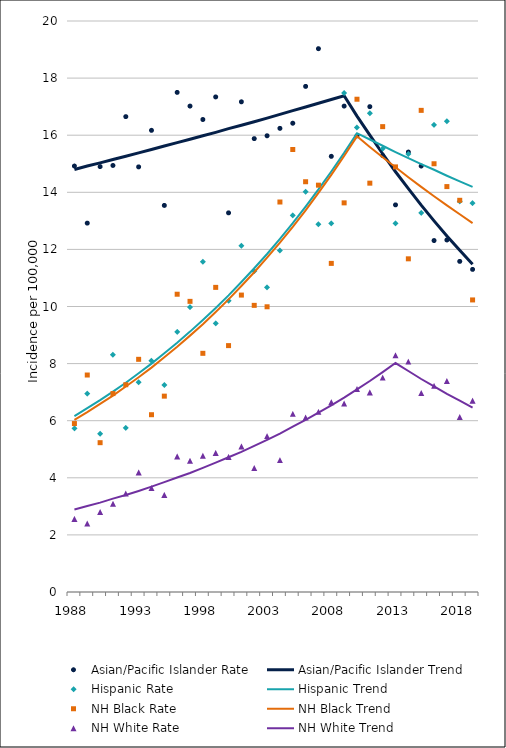
| Category | Asian/Pacific Islander Rate | Asian/Pacific Islander Trend | Hispanic Rate | Hispanic Trend | NH Black Rate | NH Black Trend | NH White Rate | NH White Trend |
|---|---|---|---|---|---|---|---|---|
| 1988.0 | 14.92 | 14.8 | 5.73 | 6.16 | 5.9 | 6.03 | 2.56 | 2.89 |
| 1989.0 | 12.92 | 14.92 | 6.95 | 6.44 | 7.6 | 6.3 | 2.4 | 3.01 |
| 1990.0 | 14.9 | 15.03 | 5.54 | 6.72 | 5.23 | 6.59 | 2.8 | 3.13 |
| 1991.0 | 14.94 | 15.15 | 8.31 | 7.02 | 6.95 | 6.88 | 3.09 | 3.27 |
| 1992.0 | 16.65 | 15.26 | 5.75 | 7.33 | 7.26 | 7.2 | 3.45 | 3.4 |
| 1993.0 | 14.89 | 15.38 | 7.35 | 7.66 | 8.15 | 7.52 | 4.19 | 3.54 |
| 1994.0 | 16.17 | 15.5 | 8.1 | 8 | 6.21 | 7.86 | 3.64 | 3.69 |
| 1995.0 | 13.54 | 15.62 | 7.25 | 8.36 | 6.86 | 8.22 | 3.4 | 3.85 |
| 1996.0 | 17.5 | 15.74 | 9.11 | 8.73 | 10.43 | 8.59 | 4.75 | 4.01 |
| 1997.0 | 17.02 | 15.86 | 9.98 | 9.12 | 10.18 | 8.98 | 4.6 | 4.17 |
| 1998.0 | 16.55 | 15.98 | 11.57 | 9.53 | 8.36 | 9.38 | 4.77 | 4.35 |
| 1999.0 | 17.34 | 16.1 | 9.41 | 9.95 | 10.67 | 9.81 | 4.87 | 4.53 |
| 2000.0 | 13.28 | 16.23 | 10.2 | 10.39 | 8.63 | 10.25 | 4.73 | 4.72 |
| 2001.0 | 17.17 | 16.35 | 12.13 | 10.86 | 10.4 | 10.72 | 5.1 | 4.91 |
| 2002.0 | 15.88 | 16.47 | 11.24 | 11.34 | 10.04 | 11.2 | 4.34 | 5.12 |
| 2003.0 | 15.98 | 16.6 | 10.67 | 11.84 | 9.99 | 11.71 | 5.46 | 5.33 |
| 2004.0 | 16.24 | 16.73 | 11.96 | 12.37 | 13.66 | 12.24 | 4.62 | 5.55 |
| 2005.0 | 16.42 | 16.86 | 13.19 | 12.92 | 15.5 | 12.79 | 6.24 | 5.79 |
| 2006.0 | 17.71 | 16.99 | 14.02 | 13.5 | 14.37 | 13.37 | 6.11 | 6.03 |
| 2007.0 | 19.03 | 17.12 | 12.88 | 14.1 | 14.25 | 13.98 | 6.31 | 6.28 |
| 2008.0 | 15.26 | 17.25 | 12.91 | 14.73 | 11.51 | 14.61 | 6.65 | 6.54 |
| 2009.0 | 17.02 | 17.38 | 17.48 | 15.38 | 13.63 | 15.27 | 6.6 | 6.81 |
| 2010.0 | 15.98 | 16.67 | 16.27 | 16.07 | 17.26 | 15.96 | 7.11 | 7.1 |
| 2011.0 | 17 | 16 | 16.77 | 15.85 | 14.32 | 15.59 | 6.99 | 7.39 |
| 2012.0 | 15.29 | 15.35 | 15.53 | 15.63 | 16.3 | 15.23 | 7.51 | 7.7 |
| 2013.0 | 13.56 | 14.72 | 12.91 | 15.41 | 14.89 | 14.88 | 8.29 | 8.02 |
| 2014.0 | 15.41 | 14.13 | 15.34 | 15.2 | 11.67 | 14.53 | 8.07 | 7.74 |
| 2015.0 | 14.92 | 13.55 | 13.28 | 14.99 | 16.87 | 14.19 | 6.97 | 7.46 |
| 2016.0 | 12.31 | 13 | 16.36 | 14.79 | 15 | 13.86 | 7.22 | 7.2 |
| 2017.0 | 12.33 | 12.47 | 16.49 | 14.58 | 14.2 | 13.54 | 7.39 | 6.94 |
| 2018.0 | 11.58 | 11.97 | 13.68 | 14.38 | 13.72 | 13.23 | 6.13 | 6.7 |
| 2019.0 | 11.3 | 11.48 | 13.62 | 14.19 | 10.23 | 12.92 | 6.7 | 6.46 |